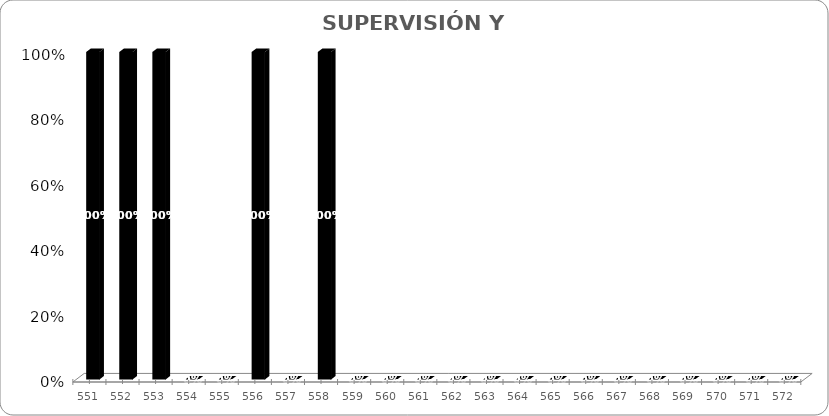
| Category | Series 0 |
|---|---|
| 551.0 | 1 |
| 552.0 | 1 |
| 553.0 | 1 |
| 554.0 | 0 |
| 555.0 | 0 |
| 556.0 | 1 |
| 557.0 | 0 |
| 558.0 | 1 |
| 559.0 | 0 |
| 560.0 | 0 |
| 561.0 | 0 |
| 562.0 | 0 |
| 563.0 | 0 |
| 564.0 | 0 |
| 565.0 | 0 |
| 566.0 | 0 |
| 567.0 | 0 |
| 568.0 | 0 |
| 569.0 | 0 |
| 570.0 | 0 |
| 571.0 | 0 |
| 572.0 | 0 |